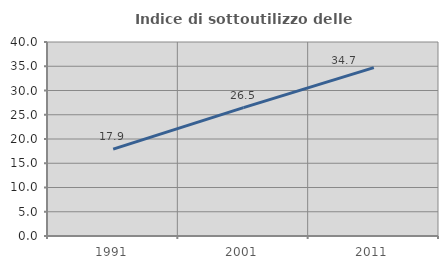
| Category | Indice di sottoutilizzo delle abitazioni  |
|---|---|
| 1991.0 | 17.899 |
| 2001.0 | 26.464 |
| 2011.0 | 34.722 |